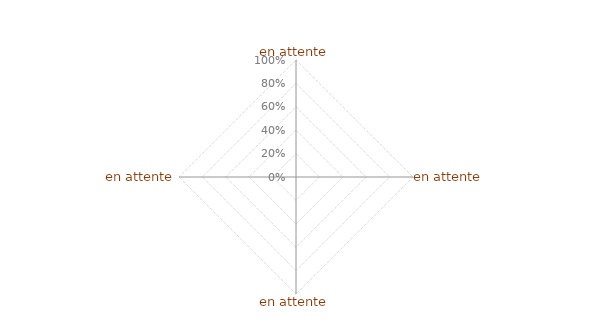
| Category | Article 7 |
|---|---|
| 0 | 0 |
| 1 | 0 |
| 2 | 0 |
| 3 | 0 |